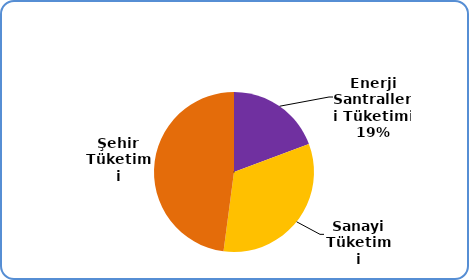
| Category | Series 0 |
|---|---|
| Enerji Santralleri Tüketimi | 4135304.099 |
| Sanayi Tüketimi | 7030533.389 |
| Şehir Tüketimi | 10270164.989 |